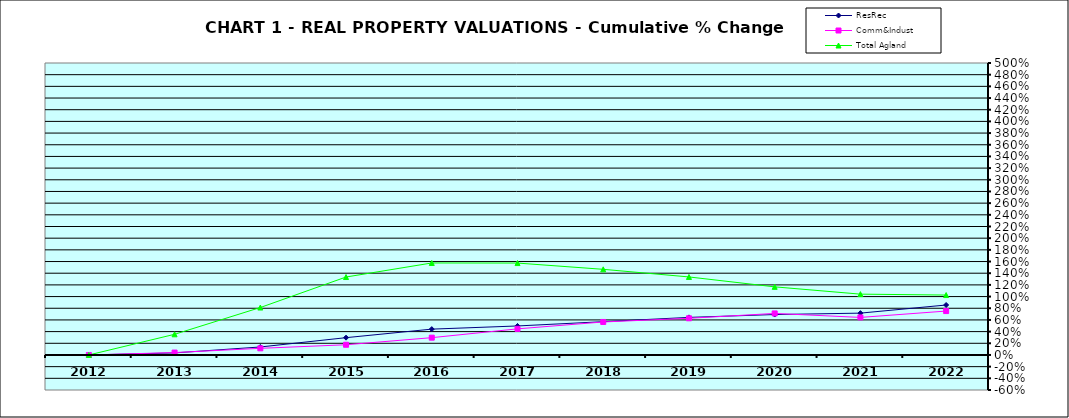
| Category | ResRec | Comm&Indust | Total Agland |
|---|---|---|---|
| 2012.0 | 0 | 0 | 0 |
| 2013.0 | 0.035 | 0.041 | 0.354 |
| 2014.0 | 0.137 | 0.114 | 0.812 |
| 2015.0 | 0.296 | 0.175 | 1.335 |
| 2016.0 | 0.442 | 0.296 | 1.575 |
| 2017.0 | 0.497 | 0.447 | 1.574 |
| 2018.0 | 0.57 | 0.565 | 1.467 |
| 2019.0 | 0.644 | 0.628 | 1.336 |
| 2020.0 | 0.692 | 0.711 | 1.167 |
| 2021.0 | 0.716 | 0.643 | 1.042 |
| 2022.0 | 0.856 | 0.752 | 1.026 |